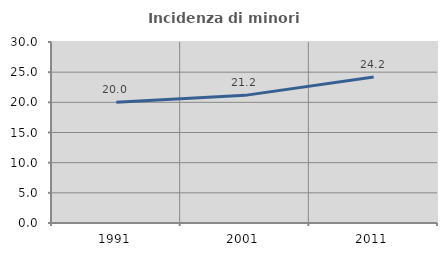
| Category | Incidenza di minori stranieri |
|---|---|
| 1991.0 | 20 |
| 2001.0 | 21.154 |
| 2011.0 | 24.2 |